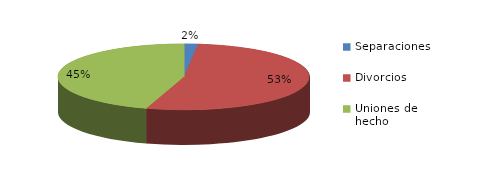
| Category | Series 0 |
|---|---|
| Separaciones | 10 |
| Divorcios | 303 |
| Uniones de hecho | 258 |